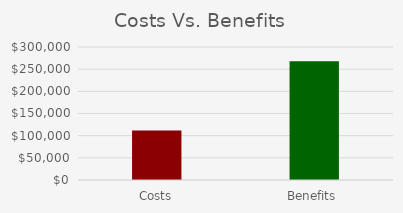
| Category | Value |
|---|---|
| Costs | 111558.441 |
| Benefits | 267596.204 |